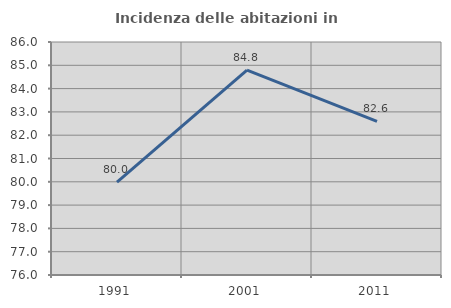
| Category | Incidenza delle abitazioni in proprietà  |
|---|---|
| 1991.0 | 79.986 |
| 2001.0 | 84.792 |
| 2011.0 | 82.592 |